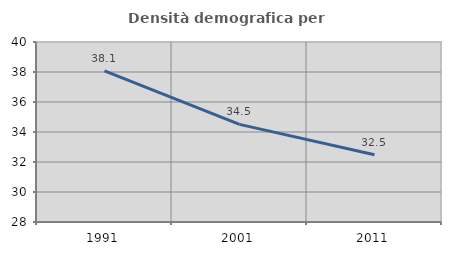
| Category | Densità demografica |
|---|---|
| 1991.0 | 38.068 |
| 2001.0 | 34.507 |
| 2011.0 | 32.489 |